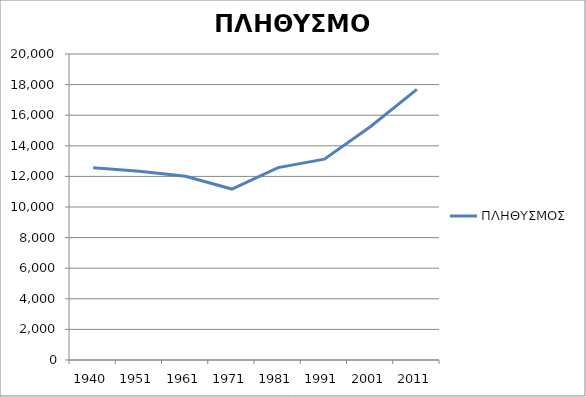
| Category | ΠΛΗΘΥΣΜΟΣ |
|---|---|
| 1940.0 | 12562 |
| 1951.0 | 12343 |
| 1961.0 | 12004 |
| 1971.0 | 11172 |
| 1981.0 | 12573 |
| 1991.0 | 13127 |
| 2001.0 | 15265 |
| 2011.0 | 17686 |